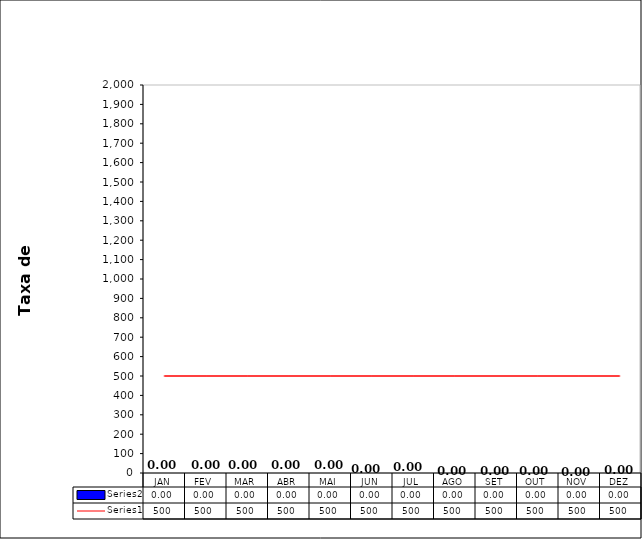
| Category | Series 5 |
|---|---|
| JAN | 0 |
| FEV | 0 |
| MAR | 0 |
| ABR | 0 |
| MAI | 0 |
| JUN | 0 |
| JUL | 0 |
| AGO | 0 |
| SET | 0 |
| OUT | 0 |
| NOV | 0 |
| DEZ | 0 |